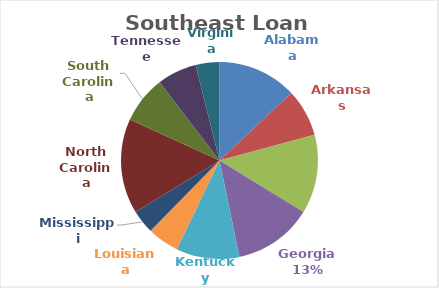
| Category | Series 0 |
|---|---|
| Alabama | 10 |
| Arkansas | 6 |
| Florida | 10 |
| Georgia | 10 |
| Kentucky | 8 |
| Louisiana | 4 |
| Mississippi | 3 |
| North Carolina | 12 |
| South Carolina | 6 |
| Tennessee | 5 |
| Virginia | 3 |